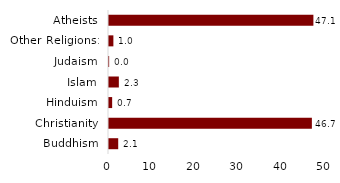
| Category | Series 0 |
|---|---|
| Buddhism | 2.123 |
| Christianity | 46.746 |
| Hinduism | 0.726 |
| Islam | 2.268 |
| Judaism | 0.033 |
| Other Religions: | 1.009 |
| Atheists | 47.095 |